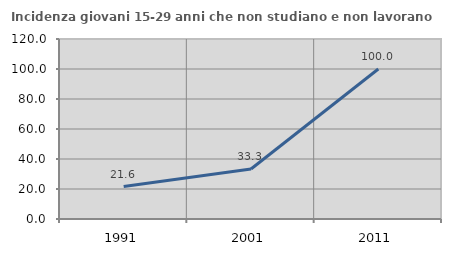
| Category | Incidenza giovani 15-29 anni che non studiano e non lavorano  |
|---|---|
| 1991.0 | 21.596 |
| 2001.0 | 33.333 |
| 2011.0 | 100 |